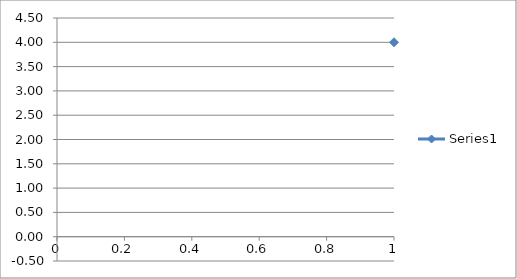
| Category | Series 0 |
|---|---|
| 0 | 4.001 |
| 1 | 3.8 |
| 2 | 3.601 |
| 3 | 3.401 |
| 4 | 3.2 |
| 5 | 3.001 |
| 6 | 2.8 |
| 7 | 2.6 |
| 8 | 2.4 |
| 9 | 2.2 |
| 10 | 2 |
| 11 | 1.8 |
| 12 | 1.6 |
| 13 | 1.399 |
| 14 | 1.199 |
| 15 | 1 |
| 16 | 0.799 |
| 17 | 0.599 |
| 18 | 0.399 |
| 19 | 0.199 |
| 20 | -0.001 |